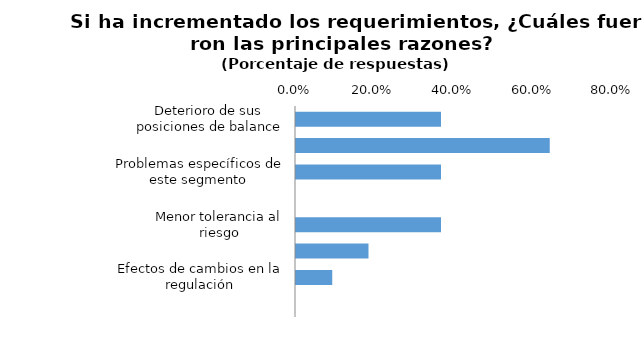
| Category | 36.4% |
|---|---|
| Deterioro de sus posiciones de balance | 0.364 |
| Una perspectiva económica menos favorable o incierta | 0.636 |
| Problemas específicos de este segmento | 0.364 |
| Menor competencia de otras entidades | 0 |
| Menor tolerancia al riesgo | 0.364 |
| Mayor preocupación por liquidez | 0.182 |
| Efectos de cambios en la regulación | 0.091 |
| Otra (especifique) | 0 |